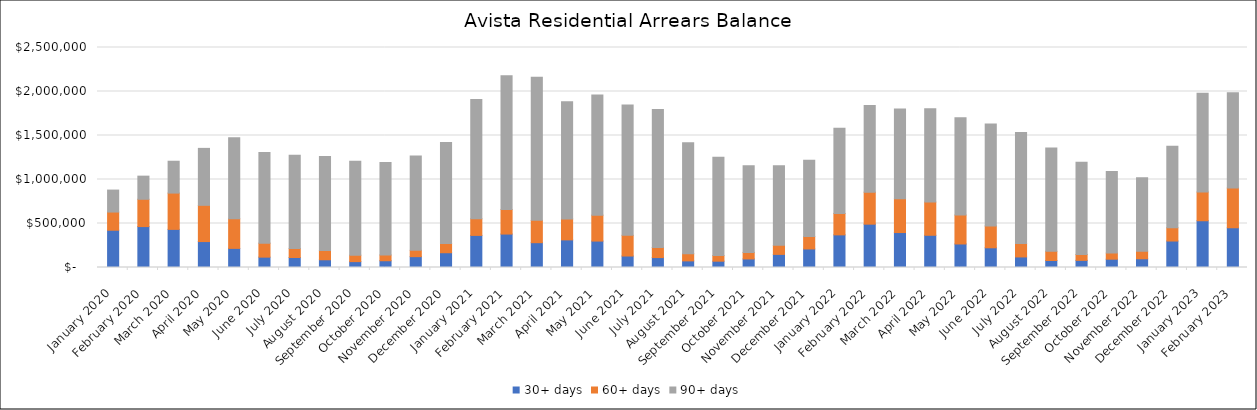
| Category | 30+ days | 60+ days | 90+ days |
|---|---|---|---|
| 2020-01-01 | 423364.07 | 206842.6 | 249642.2 |
| 2020-02-01 | 464995.06 | 310405.19 | 262742.34 |
| 2020-03-01 | 433075.84 | 412515.86 | 361980.22 |
| 2020-04-01 | 294716.2 | 411827.08 | 647154.56 |
| 2020-05-01 | 217360.58 | 335689.5 | 920438.23 |
| 2020-06-01 | 117732.75 | 159114.25 | 1029347.43 |
| 2020-07-01 | 113920.5 | 100684.93 | 1062118.03 |
| 2020-08-01 | 87768.79 | 104980.66 | 1068955.66 |
| 2020-09-01 | 66815.27 | 73532.76 | 1065624.28 |
| 2020-10-01 | 76871.24 | 65666.88 | 1051261.06 |
| 2020-11-01 | 123264.88 | 71669.09 | 1070989.36 |
| 2020-12-01 | 167829.17 | 105275.36 | 1147386.8 |
| 2021-01-01 | 364739 | 189089 | 1355973 |
| 2021-02-01 | 379922.23 | 278608.77 | 1520344.24 |
| 2021-03-01 | 282006.48 | 253541.97 | 1627422.41 |
| 2021-04-01 | 313755.04 | 238439.86 | 1331806.95 |
| 2021-05-01 | 300292.16 | 294841.15 | 1365543.97 |
| 2021-06-01 | 130400.44 | 235120.29 | 1479881.4 |
| 2021-07-01 | 112729.77 | 115022.28 | 1566707 |
| 2021-08-01 | 75063.28 | 82356.59 | 1260021.13 |
| 2021-09-01 | 71699.34 | 64200.84 | 1116324.8 |
| 2021-10-01 | 97081.55 | 74643.2 | 983597.84 |
| 2021-11-01 | 148894.15 | 103145.27 | 903212.44 |
| 2021-12-01 | 210690.77 | 140167.49 | 868861.13 |
| 2022-01-01 | 370757.17 | 243522.56 | 969328.36 |
| 2022-02-01 | 492397.85 | 363908.38 | 985065.59 |
| 2022-03-01 | 397314.31 | 382812.78 | 1021251.27 |
| 2022-04-01 | 366176.97 | 377411.49 | 1059376.18 |
| 2022-05-01 | 267252.31 | 328926.34 | 1104552.29 |
| 2022-06-01 | 223953.53 | 248294.45 | 1159354.97 |
| 2022-07-01 | 119929.3 | 152273.74 | 1261683.47 |
| 2022-08-01 | 79501.88 | 104422.66 | 1174703.39 |
| 2022-09-01 | 81048.42 | 67318.34 | 1048840.6 |
| 2022-10-01 | 94407.08 | 69404.98 | 927008.61 |
| 2022-11-01 | 99067.41 | 86148.59 | 833636.47 |
| 2022-12-01 | 300832.22 | 150403.53 | 927881.84 |
| 2023-01-01 | 531243.13 | 326594.96 | 1123273.44 |
| 2023-02-01 | 451503.92 | 451716.78 | 1081693.43 |